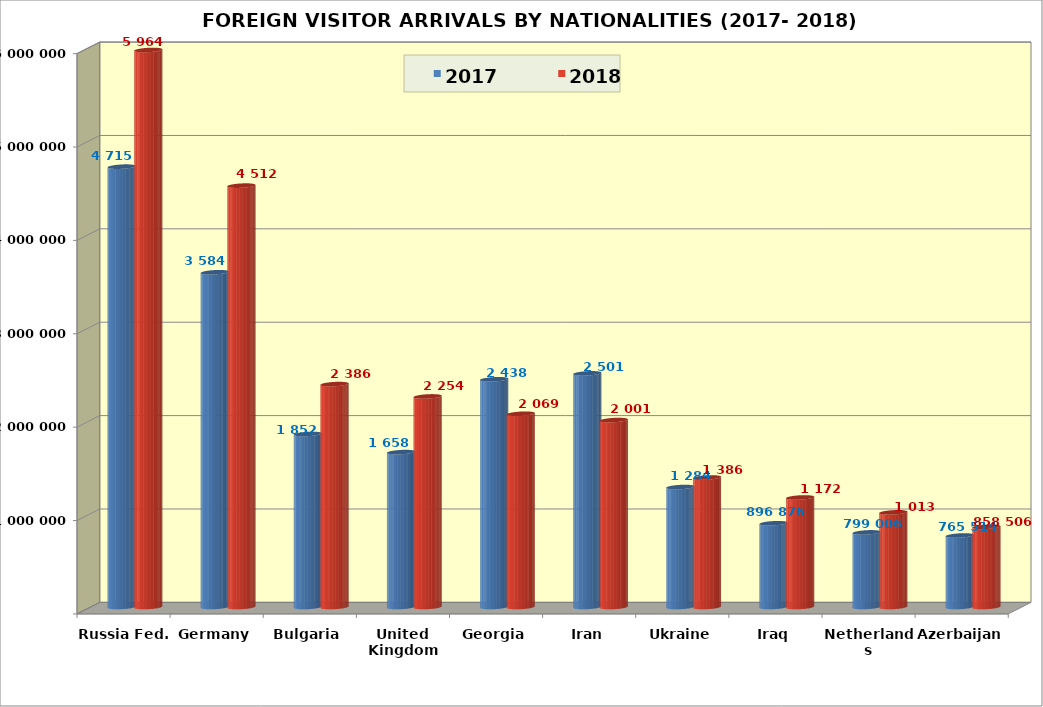
| Category | 2017 | 2018 |
|---|---|---|
| Russia Fed. | 4715438 | 5964613 |
| Germany | 3584653 | 4512360 |
| Bulgaria | 1852867 | 2386885 |
| United Kingdom (UK) | 1658715 | 2254871 |
| Georgia | 2438730 | 2069392 |
| Iran | 2501948 | 2001744 |
| Ukraine | 1284735 | 1386934 |
| Iraq | 896876 | 1172896 |
| Netherlands | 799006 | 1013642 |
| Azerbaijan | 765514 | 858506 |